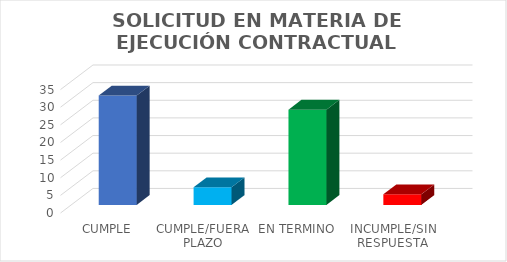
| Category | Series 0 |
|---|---|
| CUMPLE | 31 |
| CUMPLE/FUERA PLAZO | 5 |
| EN TERMINO | 27 |
| INCUMPLE/SIN RESPUESTA | 3 |